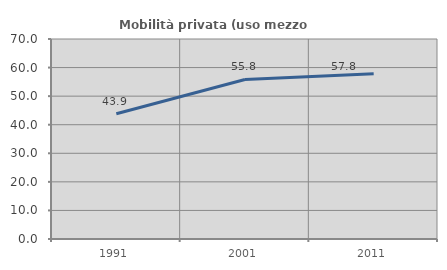
| Category | Mobilità privata (uso mezzo privato) |
|---|---|
| 1991.0 | 43.86 |
| 2001.0 | 55.828 |
| 2011.0 | 57.827 |